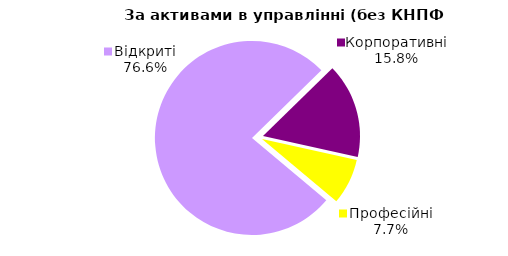
| Category | Series 0 |
|---|---|
| Відкриті | 1571.55 |
| Корпоративні | 323.732 |
| Професійні | 157.142 |